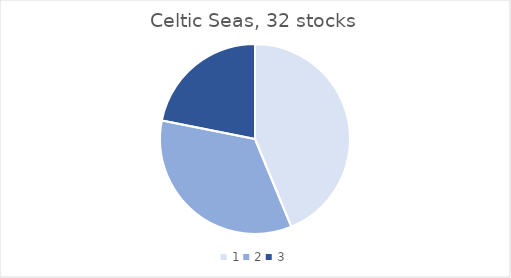
| Category | Celtic Seas |
|---|---|
| 0 | 14 |
| 1 | 11 |
| 2 | 7 |